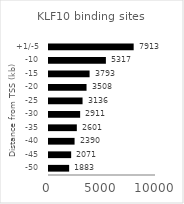
| Category | Series 0 |
|---|---|
| -50 | 1883 |
| -45 | 2071 |
| -40 | 2390 |
| -35 | 2601 |
| -30 | 2911 |
| -25 | 3136 |
| -20 | 3508 |
| -15 | 3793 |
| -10 | 5317 |
|  +1/-5 | 7913 |